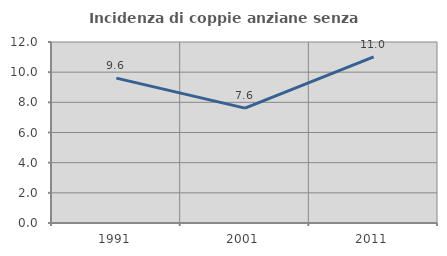
| Category | Incidenza di coppie anziane senza figli  |
|---|---|
| 1991.0 | 9.605 |
| 2001.0 | 7.614 |
| 2011.0 | 11.007 |